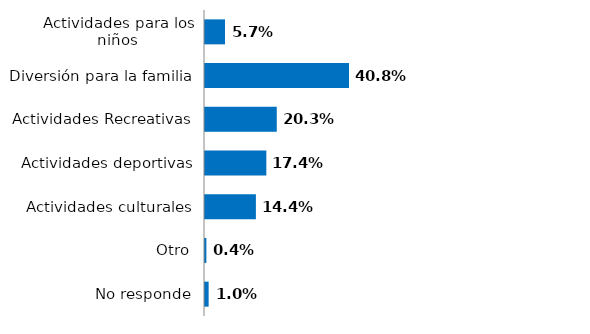
| Category | Series 0 |
|---|---|
| Actividades para los niños | 0.057 |
| Diversión para la familia | 0.408 |
| Actividades Recreativas | 0.203 |
| Actividades deportivas | 0.174 |
| Actividades culturales | 0.144 |
| Otro | 0.004 |
| No responde | 0.01 |